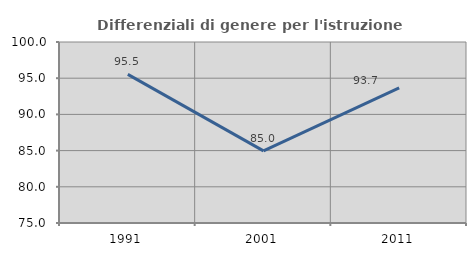
| Category | Differenziali di genere per l'istruzione superiore |
|---|---|
| 1991.0 | 95.528 |
| 2001.0 | 84.966 |
| 2011.0 | 93.655 |